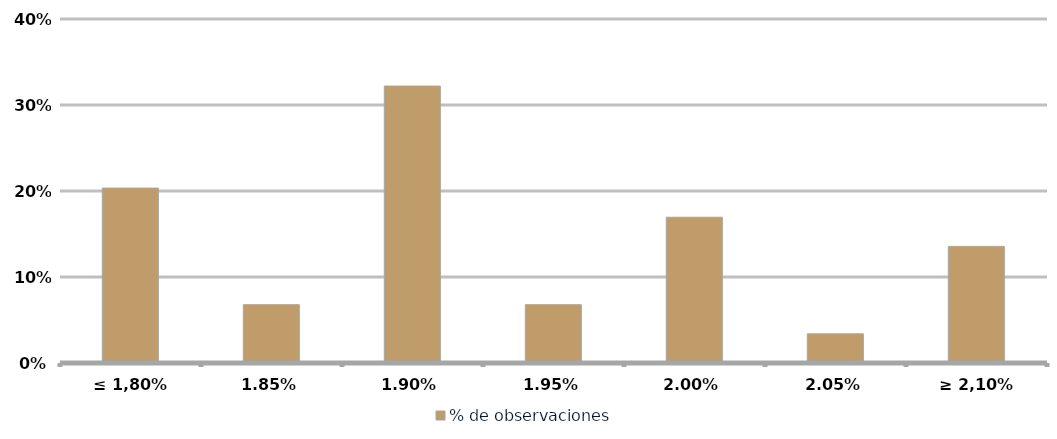
| Category | % de observaciones  |
|---|---|
| ≤ 1,80% | 0.203 |
| 1,85% | 0.068 |
| 1,90% | 0.322 |
| 1,95% | 0.068 |
| 2,00% | 0.169 |
| 2,05% | 0.034 |
| ≥ 2,10% | 0.136 |